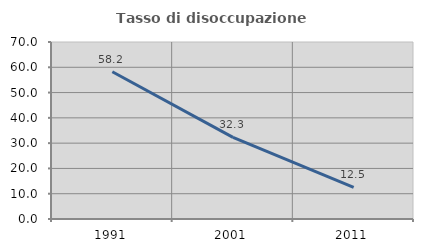
| Category | Tasso di disoccupazione giovanile  |
|---|---|
| 1991.0 | 58.228 |
| 2001.0 | 32.258 |
| 2011.0 | 12.5 |